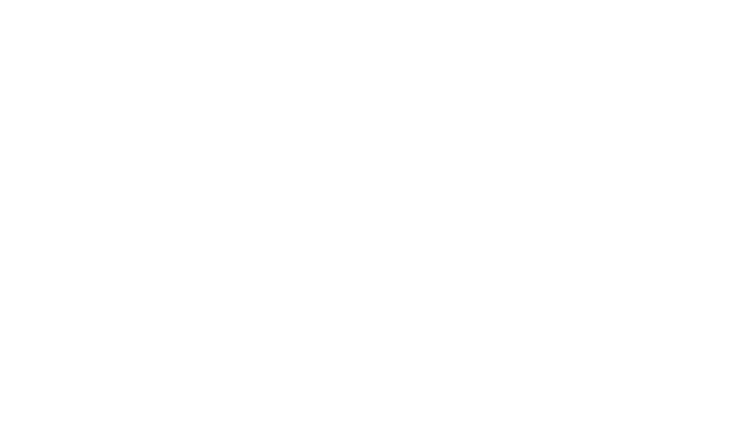
| Category | Series 0 | Series 1 | Series 2 |
|---|---|---|---|
| 0.0 | 1730.637 | 300 | 1982.523 |
| 10.0 | 1730.637 | 300 | 1982.523 |
| 90.0 | 2736.759 | 300 | 976.401 |
| 100.0 | 2736.759 | 300 | 976.401 |